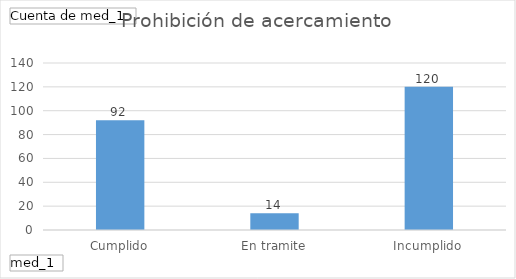
| Category | Total |
|---|---|
| Cumplido | 92 |
| En tramite | 14 |
| Incumplido | 120 |